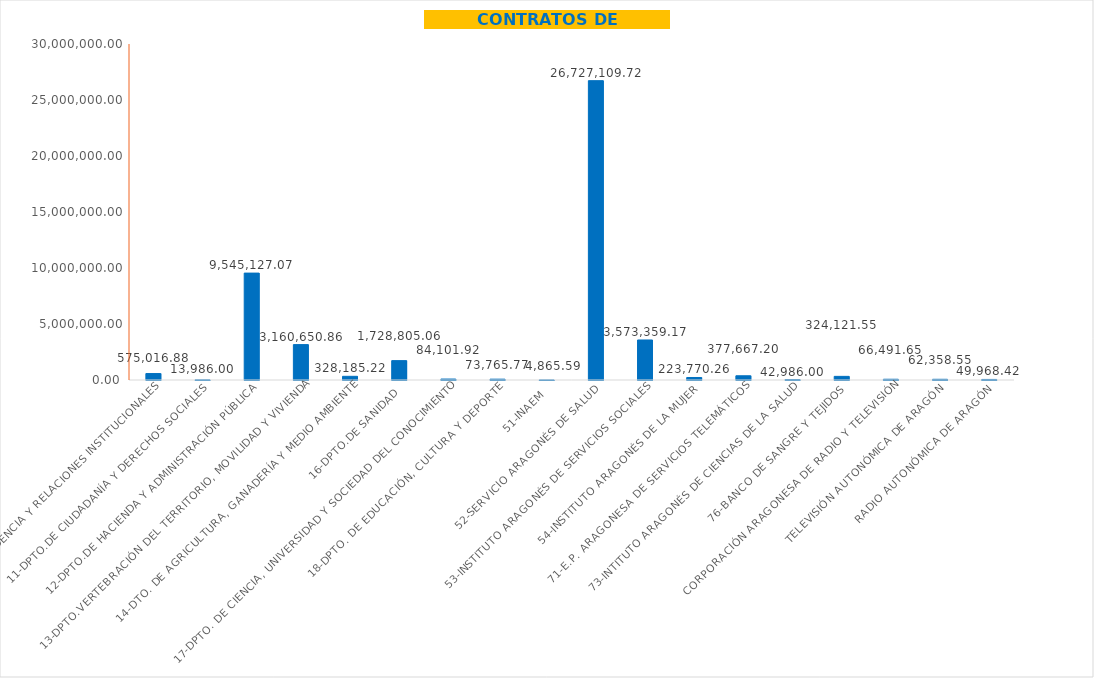
| Category | Series 0 |
|---|---|
| 10-DPTO.DE PRESIDENCIA Y RELACIONES INSTITUCIONALES | 575016.88 |
| 11-DPTO.DE CIUDADANÍA Y DERECHOS SOCIALES | 13986 |
| 12-DPTO.DE HACIENDA Y ADMINISTRACIÓN PÚBLICA | 9545127.07 |
| 13-DPTO.VERTEBRACIÓN DEL TERRITORIO, MOVILIDAD Y VIVIENDA | 3160650.86 |
| 14-DTO. DE AGRICULTURA, GANADERÍA Y MEDIO AMBIENTE | 328185.22 |
| 16-DPTO.DE SANIDAD | 1728805.06 |
| 17-DPTO. DE CIENCIA, UNIVERSIDAD Y SOCIEDAD DEL CONOCIMIENTO | 84101.92 |
| 18-DPTO. DE EDUCACIÓN, CULTURA Y DEPORTE | 73765.77 |
| 51-INAEM | 4865.59 |
| 52-SERVICIO ARAGONÉS DE SALUD | 26727109.722 |
| 53-INSTITUTO ARAGONÉS DE SERVICIOS SOCIALES | 3573359.17 |
| 54-INSTITUTO ARAGONÉS DE LA MUJER | 223770.26 |
| 71-E.P. ARAGONESA DE SERVICIOS TELEMÁTICOS | 377667.2 |
| 73-INTITUTO ARAGONÉS DE CIENCIAS DE LA SALUD | 42986 |
| 76-BANCO DE SANGRE Y TEJIDOS | 324121.55 |
| CORPORACIÓN ARAGONESA DE RADIO Y TELEVISIÓN | 66491.65 |
| TELEVISIÓN AUTONÓMICA DE ARAGÓN | 62358.55 |
| RADIO AUTONÓMICA DE ARAGÓN | 49968.42 |